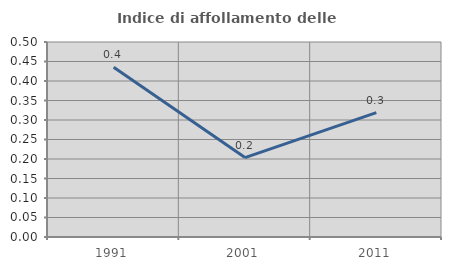
| Category | Indice di affollamento delle abitazioni  |
|---|---|
| 1991.0 | 0.435 |
| 2001.0 | 0.204 |
| 2011.0 | 0.319 |